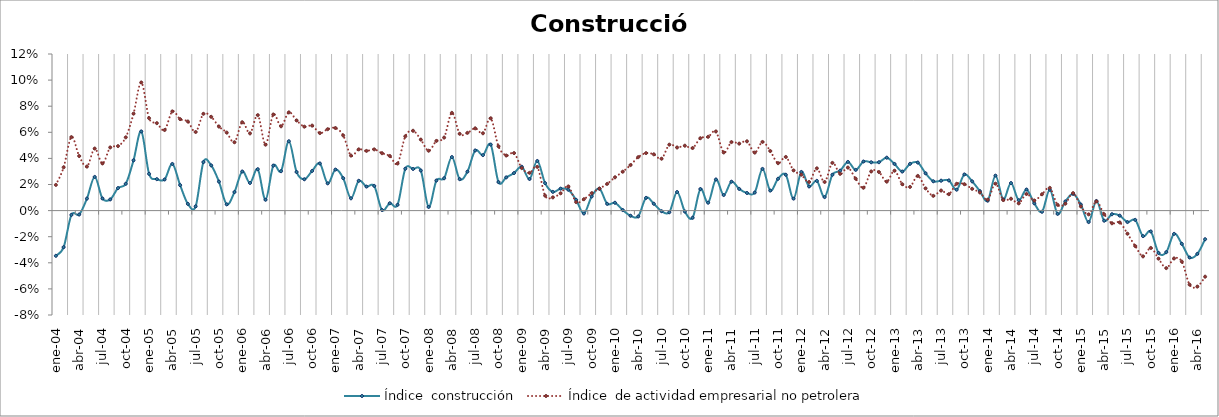
| Category | Índice  construcción | Índice  de actividad empresarial no petrolera |
|---|---|---|
| 2004-01-01 | -0.035 | 0.02 |
| 2004-02-01 | -0.028 | 0.033 |
| 2004-03-01 | -0.003 | 0.056 |
| 2004-04-01 | -0.003 | 0.042 |
| 2004-05-01 | 0.009 | 0.034 |
| 2004-06-01 | 0.026 | 0.048 |
| 2004-07-01 | 0.009 | 0.036 |
| 2004-08-01 | 0.009 | 0.048 |
| 2004-09-01 | 0.017 | 0.049 |
| 2004-10-01 | 0.021 | 0.056 |
| 2004-11-01 | 0.039 | 0.074 |
| 2004-12-01 | 0.061 | 0.098 |
| 2005-01-01 | 0.028 | 0.071 |
| 2005-02-01 | 0.024 | 0.067 |
| 2005-03-01 | 0.024 | 0.062 |
| 2005-04-01 | 0.036 | 0.076 |
| 2005-05-01 | 0.02 | 0.07 |
| 2005-06-01 | 0.005 | 0.068 |
| 2005-07-01 | 0.003 | 0.06 |
| 2005-08-01 | 0.037 | 0.074 |
| 2005-09-01 | 0.035 | 0.072 |
| 2005-10-01 | 0.022 | 0.064 |
| 2005-11-01 | 0.005 | 0.06 |
| 2005-12-01 | 0.014 | 0.052 |
| 2006-01-01 | 0.03 | 0.068 |
| 2006-02-01 | 0.021 | 0.059 |
| 2006-03-01 | 0.032 | 0.073 |
| 2006-04-01 | 0.008 | 0.051 |
| 2006-05-01 | 0.034 | 0.074 |
| 2006-06-01 | 0.03 | 0.065 |
| 2006-07-01 | 0.053 | 0.075 |
| 2006-08-01 | 0.03 | 0.069 |
| 2006-09-01 | 0.024 | 0.064 |
| 2006-10-01 | 0.03 | 0.065 |
| 2006-11-01 | 0.036 | 0.059 |
| 2006-12-01 | 0.021 | 0.062 |
| 2007-01-01 | 0.031 | 0.063 |
| 2007-02-01 | 0.025 | 0.058 |
| 2007-03-01 | 0.009 | 0.042 |
| 2007-04-01 | 0.023 | 0.047 |
| 2007-05-01 | 0.018 | 0.046 |
| 2007-06-01 | 0.019 | 0.047 |
| 2007-07-01 | 0 | 0.044 |
| 2007-08-01 | 0.006 | 0.042 |
| 2007-09-01 | 0.004 | 0.036 |
| 2007-10-01 | 0.032 | 0.057 |
| 2007-11-01 | 0.032 | 0.061 |
| 2007-12-01 | 0.031 | 0.054 |
| 2008-01-01 | 0.003 | 0.046 |
| 2008-02-01 | 0.023 | 0.053 |
| 2008-03-01 | 0.025 | 0.056 |
| 2008-04-01 | 0.041 | 0.075 |
| 2008-05-01 | 0.024 | 0.059 |
| 2008-06-01 | 0.03 | 0.06 |
| 2008-07-01 | 0.046 | 0.063 |
| 2008-08-01 | 0.043 | 0.059 |
| 2008-09-01 | 0.051 | 0.071 |
| 2008-10-01 | 0.022 | 0.049 |
| 2008-11-01 | 0.025 | 0.042 |
| 2008-12-01 | 0.029 | 0.044 |
| 2009-01-01 | 0.034 | 0.033 |
| 2009-02-01 | 0.024 | 0.029 |
| 2009-03-01 | 0.038 | 0.033 |
| 2009-04-01 | 0.021 | 0.012 |
| 2009-05-01 | 0.014 | 0.01 |
| 2009-06-01 | 0.017 | 0.013 |
| 2009-07-01 | 0.016 | 0.019 |
| 2009-08-01 | 0.008 | 0.006 |
| 2009-09-01 | -0.002 | 0.009 |
| 2009-10-01 | 0.011 | 0.013 |
| 2009-11-01 | 0.017 | 0.017 |
| 2009-12-01 | 0.005 | 0.02 |
| 2010-01-01 | 0.006 | 0.026 |
| 2010-02-01 | 0 | 0.03 |
| 2010-03-01 | -0.004 | 0.035 |
| 2010-04-01 | -0.004 | 0.041 |
| 2010-05-01 | 0.01 | 0.044 |
| 2010-06-01 | 0.005 | 0.043 |
| 2010-07-01 | 0 | 0.04 |
| 2010-08-01 | -0.001 | 0.051 |
| 2010-09-01 | 0.014 | 0.048 |
| 2010-10-01 | -0.001 | 0.05 |
| 2010-11-01 | -0.005 | 0.048 |
| 2010-12-01 | 0.017 | 0.055 |
| 2011-01-01 | 0.006 | 0.057 |
| 2011-02-01 | 0.024 | 0.061 |
| 2011-03-01 | 0.012 | 0.045 |
| 2011-04-01 | 0.022 | 0.053 |
| 2011-05-01 | 0.017 | 0.051 |
| 2011-06-01 | 0.014 | 0.053 |
| 2011-07-01 | 0.014 | 0.044 |
| 2011-08-01 | 0.032 | 0.053 |
| 2011-09-01 | 0.015 | 0.046 |
| 2011-10-01 | 0.024 | 0.036 |
| 2011-11-01 | 0.027 | 0.041 |
| 2011-12-01 | 0.009 | 0.031 |
| 2012-01-01 | 0.03 | 0.028 |
| 2012-02-01 | 0.018 | 0.022 |
| 2012-03-01 | 0.023 | 0.032 |
| 2012-04-01 | 0.01 | 0.022 |
| 2012-05-01 | 0.027 | 0.037 |
| 2012-06-01 | 0.031 | 0.028 |
| 2012-07-01 | 0.037 | 0.033 |
| 2012-08-01 | 0.031 | 0.024 |
| 2012-09-01 | 0.038 | 0.018 |
| 2012-10-01 | 0.037 | 0.03 |
| 2012-11-01 | 0.037 | 0.03 |
| 2012-12-01 | 0.041 | 0.022 |
| 2013-01-01 | 0.036 | 0.031 |
| 2013-02-01 | 0.03 | 0.02 |
| 2013-03-01 | 0.036 | 0.018 |
| 2013-04-01 | 0.037 | 0.027 |
| 2013-05-01 | 0.029 | 0.017 |
| 2013-06-01 | 0.022 | 0.011 |
| 2013-07-01 | 0.023 | 0.015 |
| 2013-08-01 | 0.023 | 0.013 |
| 2013-09-01 | 0.016 | 0.021 |
| 2013-10-01 | 0.028 | 0.02 |
| 2013-11-01 | 0.022 | 0.017 |
| 2013-12-01 | 0.015 | 0.014 |
| 2014-01-01 | 0.008 | 0.008 |
| 2014-02-01 | 0.027 | 0.021 |
| 2014-03-01 | 0.009 | 0.008 |
| 2014-04-01 | 0.021 | 0.009 |
| 2014-05-01 | 0.008 | 0.006 |
| 2014-06-01 | 0.016 | 0.013 |
| 2014-07-01 | 0.006 | 0.008 |
| 2014-08-01 | -0.001 | 0.013 |
| 2014-09-01 | 0.016 | 0.017 |
| 2014-10-01 | -0.003 | 0.004 |
| 2014-11-01 | 0.007 | 0.005 |
| 2014-12-01 | 0.013 | 0.013 |
| 2015-01-01 | 0.005 | 0.003 |
| 2015-02-01 | -0.009 | -0.003 |
| 2015-03-01 | 0.007 | 0.007 |
| 2015-04-01 | -0.008 | -0.003 |
| 2015-05-01 | -0.003 | -0.01 |
| 2015-06-01 | -0.004 | -0.009 |
| 2015-07-01 | -0.009 | -0.018 |
| 2015-08-01 | -0.007 | -0.027 |
| 2015-09-01 | -0.02 | -0.035 |
| 2015-10-01 | -0.016 | -0.029 |
| 2015-11-01 | -0.032 | -0.037 |
| 2015-12-01 | -0.032 | -0.044 |
| 2016-01-01 | -0.018 | -0.037 |
| 2016-02-01 | -0.025 | -0.039 |
| 2016-03-01 | -0.036 | -0.057 |
| 2016-04-01 | -0.033 | -0.058 |
| 2016-05-01 | -0.022 | -0.051 |